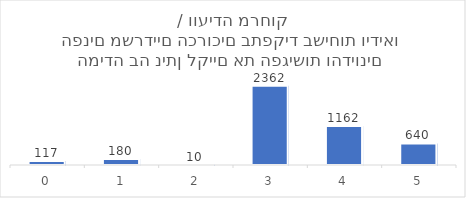
| Category | סה"כ |
|---|---|
| 0 | 117 |
| 1 | 180 |
| 2 | 10 |
| 3 | 2362 |
| 4 | 1162 |
| 5 | 640 |